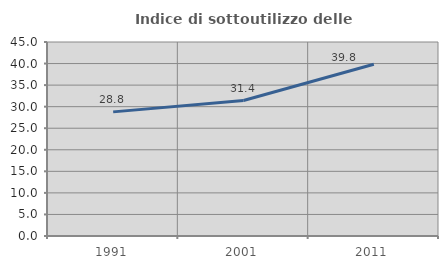
| Category | Indice di sottoutilizzo delle abitazioni  |
|---|---|
| 1991.0 | 28.793 |
| 2001.0 | 31.415 |
| 2011.0 | 39.824 |